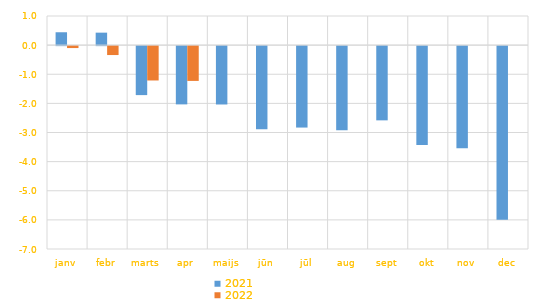
| Category | 2021 | 2022 |
|---|---|---|
| janv | 0.442 | -0.066 |
| febr | 0.428 | -0.306 |
| marts | -1.682 | -1.18 |
| apr | -2 | -1.195 |
| maijs | -2.004 | 0 |
| jūn | -2.854 | 0 |
| jūl | -2.796 | 0 |
| aug | -2.887 | 0 |
| sept | -2.549 | 0 |
| okt | -3.396 | 0 |
| nov | -3.509 | 0 |
| dec | -5.957 | 0 |